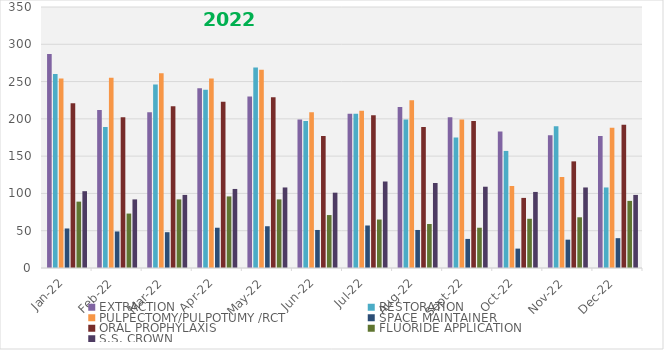
| Category | EXTRACTION | RESTORATION | PULPECTOMY/PULPOTUMY /RCT | SPACE MAINTAINER | ORAL PROPHYLAXIS | FLUORIDE APPLICATION | S.S. CROWN   |
|---|---|---|---|---|---|---|---|
| 2022-01-01 | 287 | 260 | 254 | 53 | 221 | 89 | 103 |
| 2022-02-01 | 212 | 189 | 255 | 49 | 202 | 73 | 92 |
| 2022-03-01 | 209 | 246 | 261 | 48 | 217 | 92 | 98 |
| 2022-04-01 | 241 | 239 | 254 | 54 | 223 | 96 | 106 |
| 2022-05-01 | 230 | 269 | 266 | 56 | 229 | 92 | 108 |
| 2022-06-01 | 199 | 197 | 209 | 51 | 177 | 71 | 101 |
| 2022-07-01 | 207 | 207 | 211 | 57 | 205 | 65 | 116 |
| 2022-08-01 | 216 | 199 | 225 | 51 | 189 | 59 | 114 |
| 2022-09-01 | 202 | 175 | 199 | 39 | 197 | 54 | 109 |
| 2022-10-01 | 183 | 157 | 110 | 26 | 94 | 66 | 102 |
| 2022-11-01 | 178 | 190 | 122 | 38 | 143 | 68 | 108 |
| 2022-12-01 | 177 | 108 | 188 | 40 | 192 | 90 | 98 |